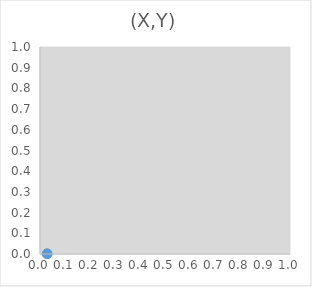
| Category | Series 0 |
|---|---|
| 0.028522664956597388 | 0.001 |